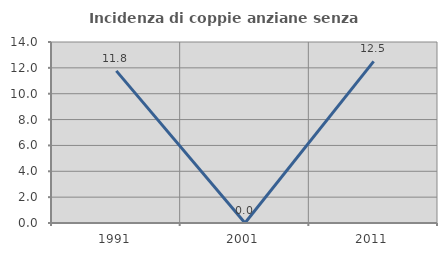
| Category | Incidenza di coppie anziane senza figli  |
|---|---|
| 1991.0 | 11.765 |
| 2001.0 | 0 |
| 2011.0 | 12.5 |